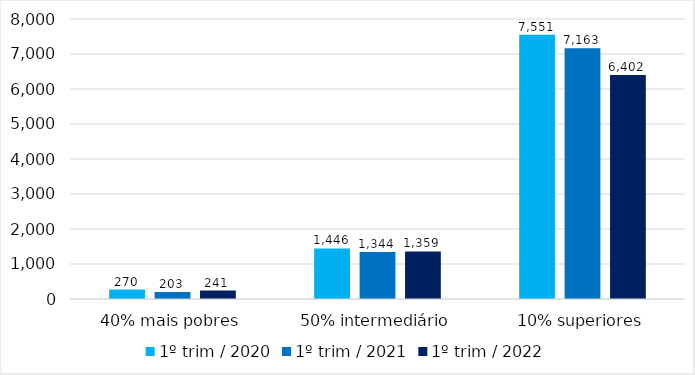
| Category | 1º trim / 2020 | 1º trim / 2021 | 1º trim / 2022 |
|---|---|---|---|
| 40% mais pobres | 269.637 | 203.073 | 240.789 |
| 50% intermediário | 1445.641 | 1344.072 | 1359.44 |
| 10% superiores | 7550.615 | 7163.195 | 6401.58 |